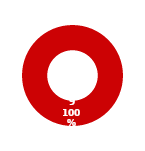
| Category | TVM |
|---|---|
| MIL 3 Complete | 0 |
| MIL 3 Not Complete | 9 |